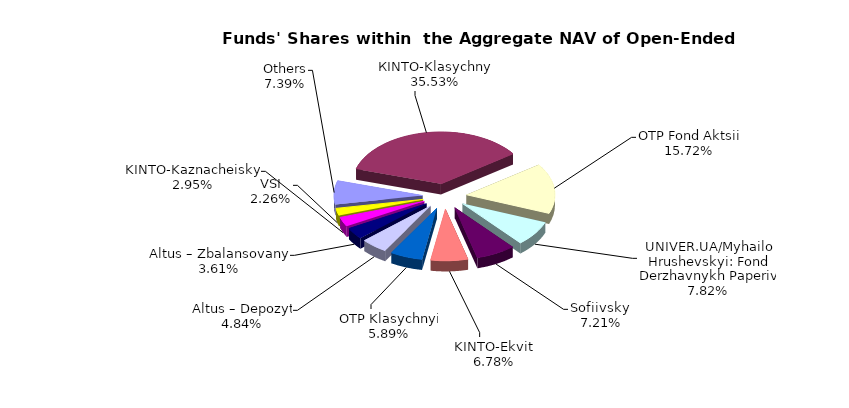
| Category | Series 0 | Series 1 |
|---|---|---|
| Others | 6254084.71 | 0.074 |
| КІNТО-Klasychnyi | 30069299.39 | 0.355 |
| ОТP Fond Aktsii | 13299455.56 | 0.157 |
| UNIVER.UA/Myhailo Hrushevskyi: Fond Derzhavnykh Paperiv | 6616525.51 | 0.078 |
| Sofiivskyi | 6101104.22 | 0.072 |
| KINTO-Ekviti | 5738896.69 | 0.068 |
| ОТP Klasychnyi | 4982246.11 | 0.059 |
| Altus – Depozyt | 4093389.24 | 0.048 |
| Altus – Zbalansovanyi | 3054568.91 | 0.036 |
| KINTO-Kaznacheiskyi | 2498882.15 | 0.03 |
| VSI | 1910765.63 | 0.023 |